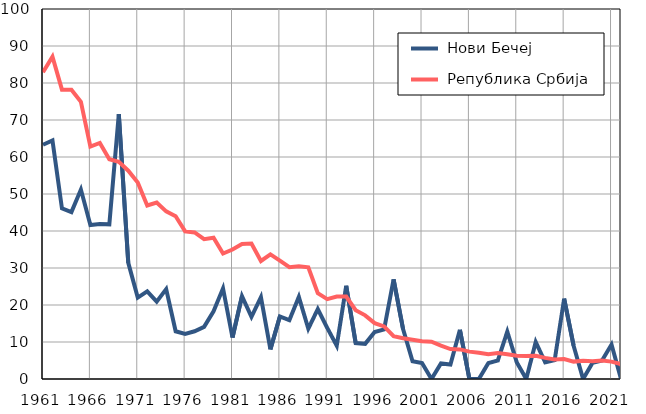
| Category |  Нови Бечеј |  Република Србија |
|---|---|---|
| 1961.0 | 63.3 | 82.9 |
| 1962.0 | 64.5 | 87.1 |
| 1963.0 | 46.1 | 78.2 |
| 1964.0 | 45.1 | 78.2 |
| 1965.0 | 51.2 | 74.9 |
| 1966.0 | 41.6 | 62.8 |
| 1967.0 | 41.9 | 63.8 |
| 1968.0 | 41.8 | 59.4 |
| 1969.0 | 71.6 | 58.7 |
| 1970.0 | 31.4 | 56.3 |
| 1971.0 | 22 | 53.1 |
| 1972.0 | 23.7 | 46.9 |
| 1973.0 | 20.9 | 47.7 |
| 1974.0 | 24.3 | 45.3 |
| 1975.0 | 12.9 | 44 |
| 1976.0 | 12.2 | 39.9 |
| 1977.0 | 12.9 | 39.6 |
| 1978.0 | 14.1 | 37.8 |
| 1979.0 | 18.3 | 38.2 |
| 1980.0 | 24.5 | 33.9 |
| 1981.0 | 11.2 | 35 |
| 1982.0 | 22.4 | 36.5 |
| 1983.0 | 16.8 | 36.6 |
| 1984.0 | 22.1 | 31.9 |
| 1985.0 | 8 | 33.7 |
| 1986.0 | 16.9 | 32 |
| 1987.0 | 15.9 | 30.2 |
| 1988.0 | 22.2 | 30.5 |
| 1989.0 | 13.6 | 30.2 |
| 1990.0 | 18.9 | 23.2 |
| 1991.0 | 13.8 | 21.6 |
| 1992.0 | 9 | 22.3 |
| 1993.0 | 25.2 | 22.3 |
| 1994.0 | 9.7 | 18.6 |
| 1995.0 | 9.5 | 17.2 |
| 1996.0 | 12.7 | 15.1 |
| 1997.0 | 13.4 | 14.2 |
| 1998.0 | 26.9 | 11.6 |
| 1999.0 | 13.5 | 11 |
| 2000.0 | 4.8 | 10.6 |
| 2001.0 | 4.3 | 10.2 |
| 2002.0 | 0 | 10.1 |
| 2003.0 | 4.2 | 9 |
| 2004.0 | 3.9 | 8.1 |
| 2005.0 | 13.3 | 8 |
| 2006.0 | 0 | 7.4 |
| 2007.0 | 0 | 7.1 |
| 2008.0 | 4.3 | 6.7 |
| 2009.0 | 5 | 7 |
| 2010.0 | 12.8 | 6.7 |
| 2011.0 | 4.5 | 6.3 |
| 2012.0 | 0 | 6.2 |
| 2013.0 | 10 | 6.3 |
| 2014.0 | 4.5 | 5.7 |
| 2015.0 | 5.1 | 5.3 |
| 2016.0 | 21.7 | 5.4 |
| 2017.0 | 9 | 4.7 |
| 2018.0 | 0 | 4.9 |
| 2019.0 | 4.4 | 4.8 |
| 2020.0 | 5 | 5 |
| 2021.0 | 9.3 | 4.7 |
| 2022.0 | 0 | 4 |